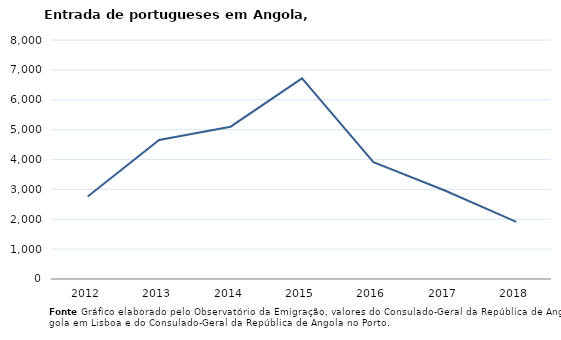
| Category | Entradas |
|---|---|
| 2012.0 | 2761 |
| 2013.0 | 4651 |
| 2014.0 | 5098 |
| 2015.0 | 6715 |
| 2016.0 | 3908 |
| 2017.0 | 2962 |
| 2018.0 | 1910 |